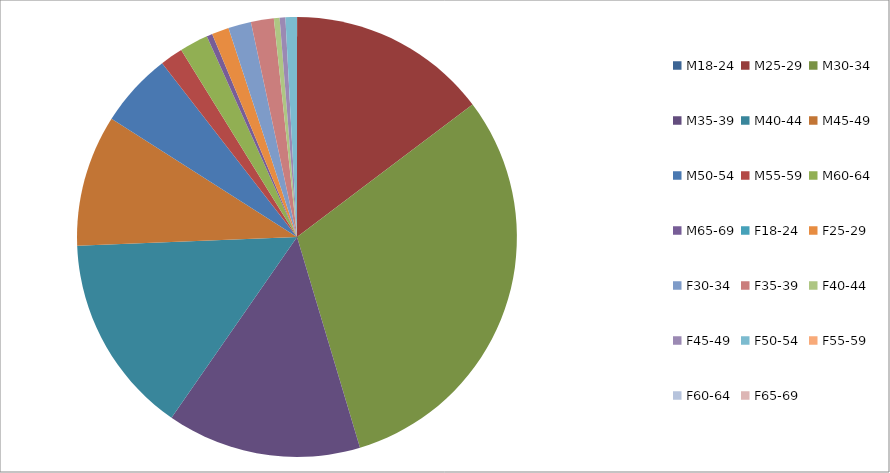
| Category | Series 0 |
|---|---|
| M18-24 | 0 |
| M25-29 | 35 |
| M30-34 | 73 |
| M35-39 | 34 |
| M40-44 | 35 |
| M45-49 | 23 |
| M50-54 | 13 |
| M55-59 | 4 |
| M60-64 | 5 |
| M65-69 | 1 |
| F18-24 | 0 |
| F25-29 | 3 |
| F30-34 | 4 |
| F35-39 | 4 |
| F40-44 | 1 |
| F45-49 | 1 |
| F50-54 | 2 |
| F55-59 | 0 |
| F60-64 | 0 |
| F65-69 | 0 |